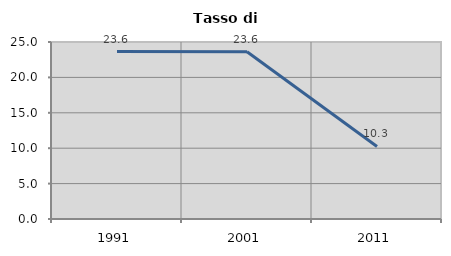
| Category | Tasso di disoccupazione   |
|---|---|
| 1991.0 | 23.643 |
| 2001.0 | 23.629 |
| 2011.0 | 10.252 |